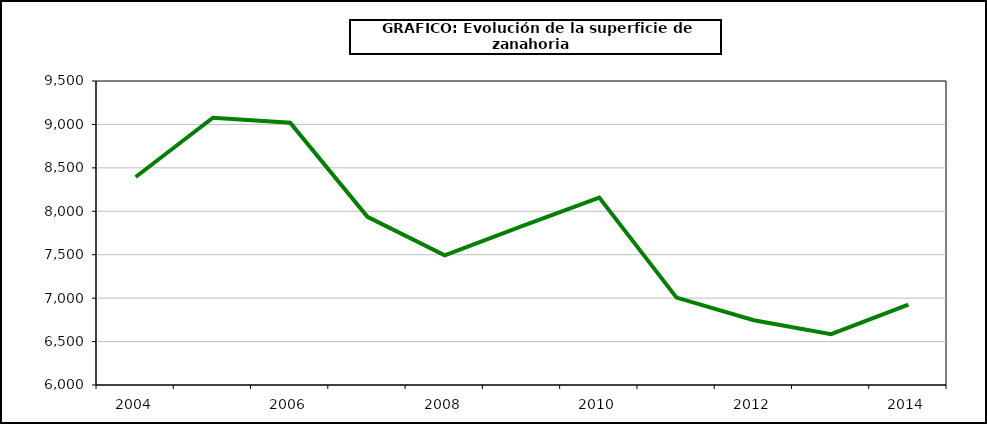
| Category | superficie |
|---|---|
| 2004.0 | 8395 |
| 2005.0 | 9077 |
| 2006.0 | 9019 |
| 2007.0 | 7936 |
| 2008.0 | 7492 |
| 2009.0 | 7828 |
| 2010.0 | 8157 |
| 2011.0 | 7006 |
| 2012.0 | 6745 |
| 2013.0 | 6586 |
| 2014.0 | 6926 |